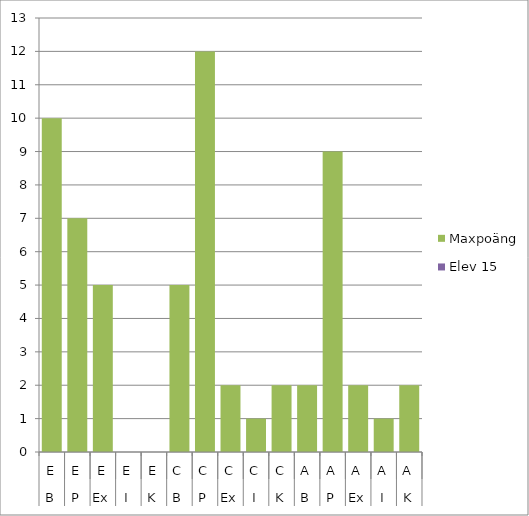
| Category | Maxpoäng | Elev 15 |
|---|---|---|
| 0 | 10 | 0 |
| 1 | 7 | 0 |
| 2 | 5 | 0 |
| 3 | 0 | 0 |
| 4 | 0 | 0 |
| 5 | 5 | 0 |
| 6 | 12 | 0 |
| 7 | 2 | 0 |
| 8 | 1 | 0 |
| 9 | 2 | 0 |
| 10 | 2 | 0 |
| 11 | 9 | 0 |
| 12 | 2 | 0 |
| 13 | 1 | 0 |
| 14 | 2 | 0 |